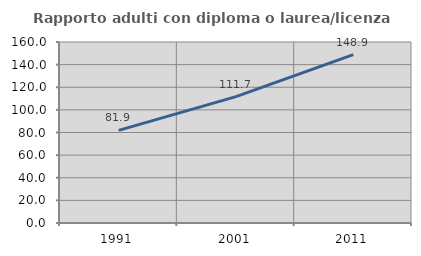
| Category | Rapporto adulti con diploma o laurea/licenza media  |
|---|---|
| 1991.0 | 81.887 |
| 2001.0 | 111.677 |
| 2011.0 | 148.881 |